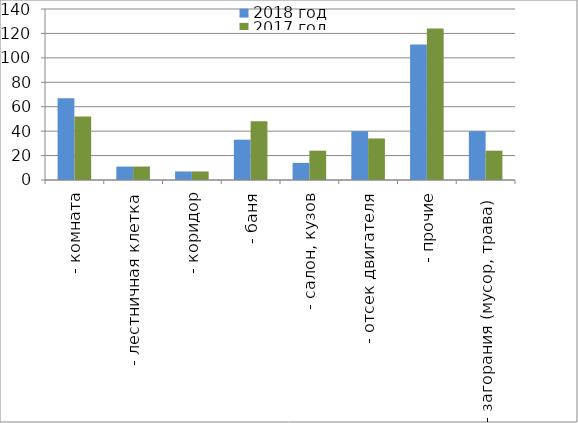
| Category | 2018 год | 2017 год |
|---|---|---|
|  - комната | 67 | 52 |
|  - лестничная клетка | 11 | 11 |
|  - коридор | 7 | 7 |
|  - баня | 33 | 48 |
|  - салон, кузов | 14 | 24 |
|  - отсек двигателя | 40 | 34 |
| - прочие | 111 | 124 |
| - загорания (мусор, трава)  | 40 | 24 |